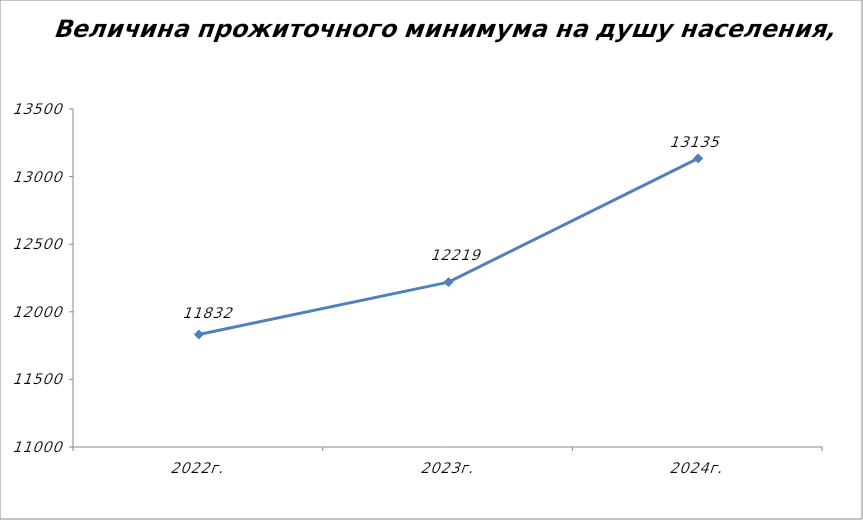
| Category | Величина прожиточного минимума на душу населения, рублей |
|---|---|
| 2022г. | 11832 |
| 2023г. | 12219 |
| 2024г. | 13135 |